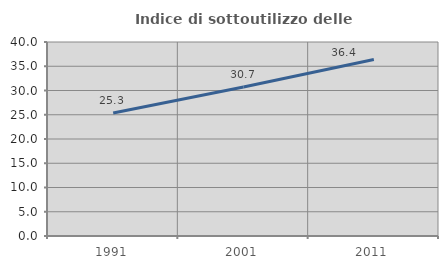
| Category | Indice di sottoutilizzo delle abitazioni  |
|---|---|
| 1991.0 | 25.347 |
| 2001.0 | 30.74 |
| 2011.0 | 36.393 |